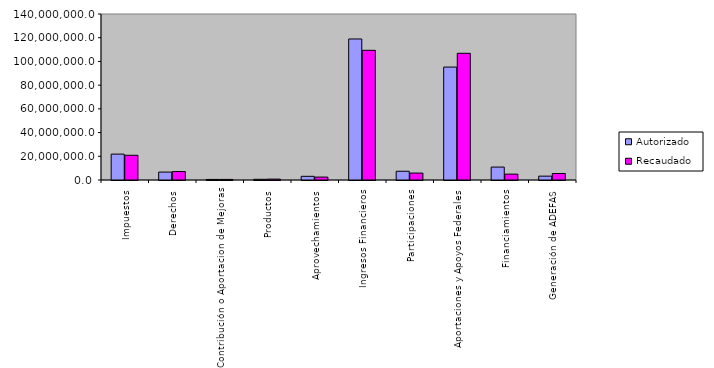
| Category | Autorizado | Recaudado |
|---|---|---|
| 0 | 21836342.2 | 20851015.5 |
| 1 | 6668975.9 | 7147996.9 |
| 2 | 486870.5 | 487906.2 |
| 3 | 591887.6 | 744237.9 |
| 4 | 3107507 | 2462092 |
| 5 | 118941762.4 | 109364276.6 |
| 6 | 7368150.7 | 5837978.3 |
| 7 | 95243430.1 | 106851985.1 |
| 8 | 10909591.9 | 4952242.2 |
| 9 | 3243691 | 5467612.9 |